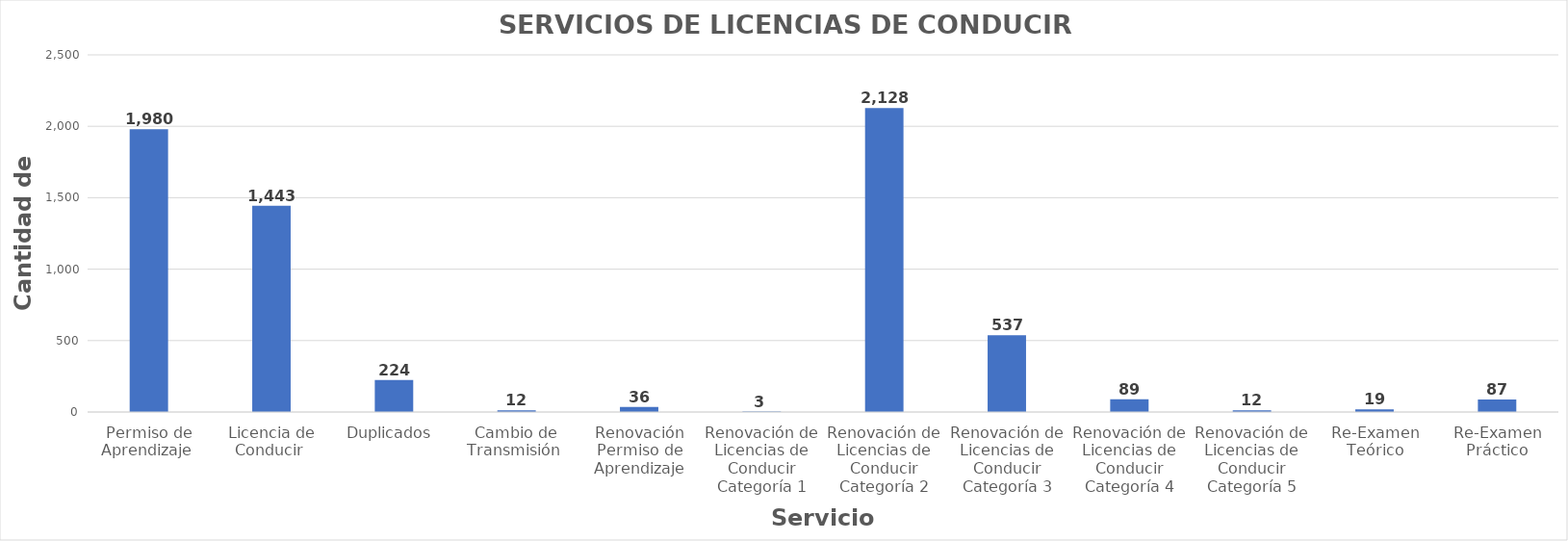
| Category | Series 0 |
|---|---|
| Permiso de Aprendizaje  | 1980 |
| Licencia de Conducir  | 1443 |
| Duplicados  | 224 |
| Cambio de Transmisión  | 12 |
| Renovación Permiso de Aprendizaje | 36 |
| Renovación de Licencias de Conducir Categoría 1 | 3 |
| Renovación de Licencias de Conducir Categoría 2 | 2128 |
| Renovación de Licencias de Conducir Categoría 3 | 537 |
| Renovación de Licencias de Conducir Categoría 4 | 89 |
| Renovación de Licencias de Conducir Categoría 5 | 12 |
| Re-Examen Teórico | 19 |
| Re-Examen Práctico | 87 |